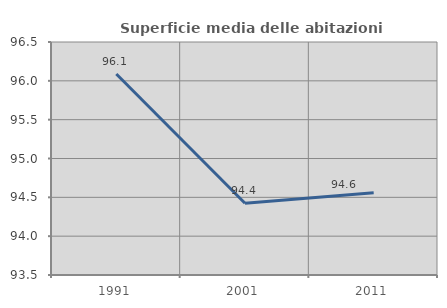
| Category | Superficie media delle abitazioni occupate |
|---|---|
| 1991.0 | 96.088 |
| 2001.0 | 94.423 |
| 2011.0 | 94.558 |